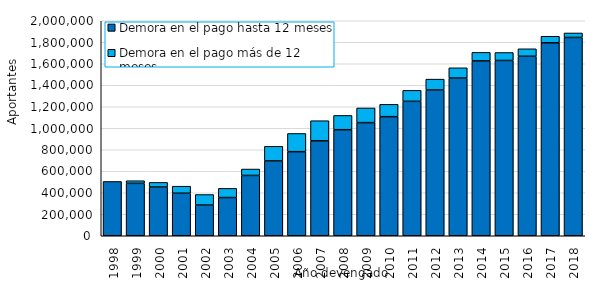
| Category | Demora en el pago hasta 12 meses | Demora en el pago más de 12 meses |
|---|---|---|
| 1998.0 | 505229.5 | 0 |
| 1999.0 | 487643 | 24283.5 |
| 2000.0 | 453460 | 42994.167 |
| 2001.0 | 395655 | 65403.417 |
| 2002.0 | 285478 | 98075.5 |
| 2003.0 | 355518 | 85359.417 |
| 2004.0 | 561001 | 59648.917 |
| 2005.0 | 696183 | 135836.917 |
| 2006.0 | 782082 | 169405.167 |
| 2007.0 | 883295 | 187040 |
| 2008.0 | 986462 | 132864.583 |
| 2009.0 | 1052446 | 136243.333 |
| 2010.0 | 1107823 | 114813.083 |
| 2011.0 | 1250360 | 102323.5 |
| 2012.0 | 1355944 | 101141.75 |
| 2013.0 | 1466818 | 95607.583 |
| 2014.0 | 1626777 | 79259.667 |
| 2015.0 | 1630476 | 74319.083 |
| 2016.0 | 1669817 | 69425.083 |
| 2017.0 | 1795109 | 60605.833 |
| 2018.0 | 1844690 | 41665.25 |